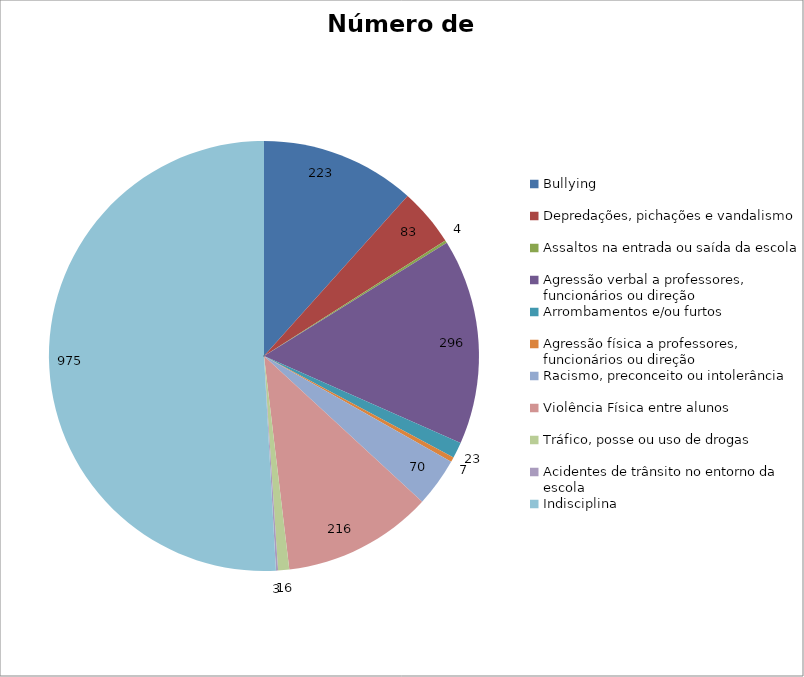
| Category | Número de Casos |
|---|---|
| Bullying | 223 |
| Depredações, pichações e vandalismo | 83 |
| Assaltos na entrada ou saída da escola | 4 |
| Agressão verbal a professores, funcionários ou direção | 296 |
| Arrombamentos e/ou furtos | 23 |
| Agressão física a professores, funcionários ou direção | 7 |
| Racismo, preconceito ou intolerância | 70 |
| Violência Física entre alunos | 216 |
| Tráfico, posse ou uso de drogas | 16 |
| Acidentes de trânsito no entorno da escola | 3 |
| Indisciplina | 975 |